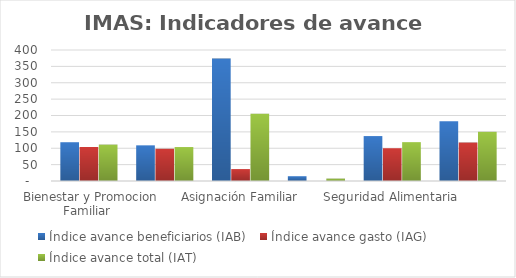
| Category | Índice avance beneficiarios (IAB)  | Índice avance gasto (IAG) | Índice avance total (IAT)  |
|---|---|---|---|
| Bienestar y Promocion Familiar | 118.398 | 103.808 | 111.103 |
| Avancemos | 108.873 | 98.483 | 103.678 |
| Asignación Familiar | 373.833 | 36.425 | 205.129 |
| Prestación Alimentaria | 14.625 | 0 | 7.312 |
| Seguridad Alimentaria | 137.185 | 100.088 | 118.636 |
| Resto de productos | 182.763 | 117.539 | 150.151 |